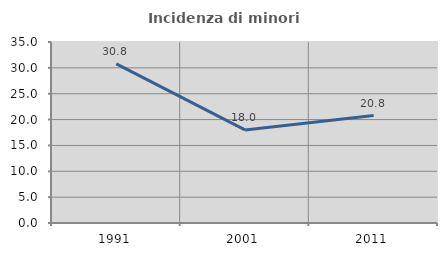
| Category | Incidenza di minori stranieri |
|---|---|
| 1991.0 | 30.769 |
| 2001.0 | 18 |
| 2011.0 | 20.787 |